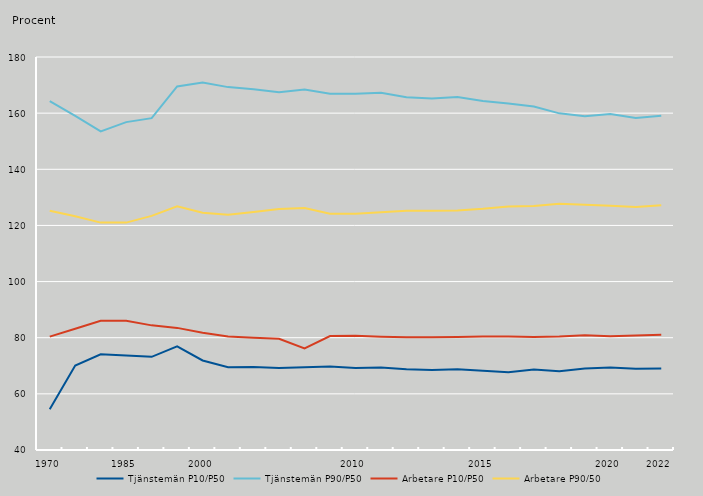
| Category | Tjänstemän P10/P50 | Tjänstemän P90/P50 | Arbetare P10/P50 | Arbetare P90/50 |
|---|---|---|---|---|
| 1970.0 | 54.5 | 164.3 | 80.4 | 125.2 |
| nan | 70.1 | 159 | 83.2 | 123.3 |
| nan | 74.1 | 153.5 | 86 | 121 |
| 1985.0 | 73.7 | 156.8 | 86 | 121 |
| nan | 73.2 | 158.2 | 84.4 | 123.4 |
| nan | 76.9 | 169.5 | 83.5 | 126.8 |
| 2000.0 | 71.9 | 170.9 | 81.8 | 124.5 |
| nan | 69.492 | 169.272 | 80.472 | 123.792 |
| nan | 69.6 | 168.5 | 80 | 124.8 |
| nan | 69.196 | 167.45 | 79.625 | 125.835 |
| nan | 69.5 | 168.4 | 76.2 | 126.2 |
| nan | 69.768 | 166.936 | 80.568 | 124.163 |
| 2010.0 | 69.227 | 166.88 | 80.695 | 124.156 |
| nan | 69.41 | 167.253 | 80.381 | 124.669 |
| nan | 68.765 | 165.661 | 80.182 | 125.198 |
| nan | 68.526 | 165.228 | 80.171 | 125.189 |
| nan | 68.747 | 165.734 | 80.265 | 125.293 |
| 2015.0 | 68.233 | 164.312 | 80.449 | 125.901 |
| nan | 67.683 | 163.462 | 80.47 | 126.713 |
| nan | 68.645 | 162.333 | 80.275 | 126.949 |
| nan | 68.033 | 159.922 | 80.435 | 127.693 |
| nan | 69.034 | 158.856 | 80.86 | 127.327 |
| 2020.0 | 69.404 | 159.653 | 80.546 | 127.015 |
| nan | 68.933 | 158.258 | 80.807 | 126.601 |
| 2022.0 | 69.054 | 159.054 | 81.017 | 127.196 |